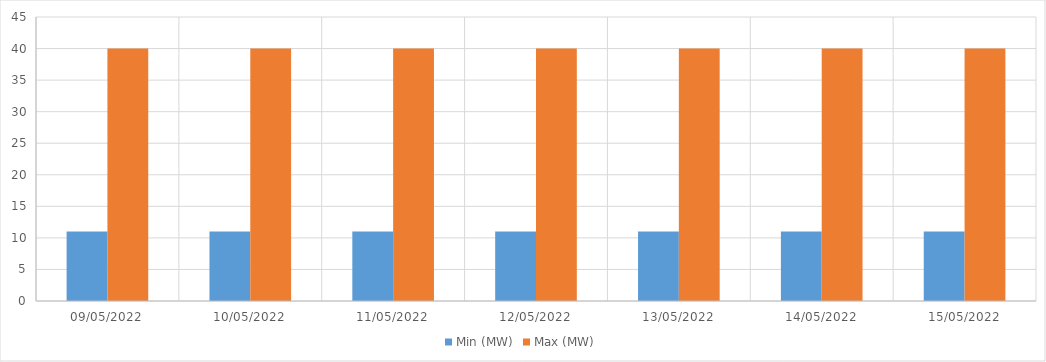
| Category | Min (MW) | Max (MW) |
|---|---|---|
| 09/05/2022 | 11 | 40 |
| 10/05/2022 | 11 | 40 |
| 11/05/2022 | 11 | 40 |
| 12/05/2022 | 11 | 40 |
| 13/05/2022 | 11 | 40 |
| 14/05/2022 | 11 | 40 |
| 15/05/2022 | 11 | 40 |